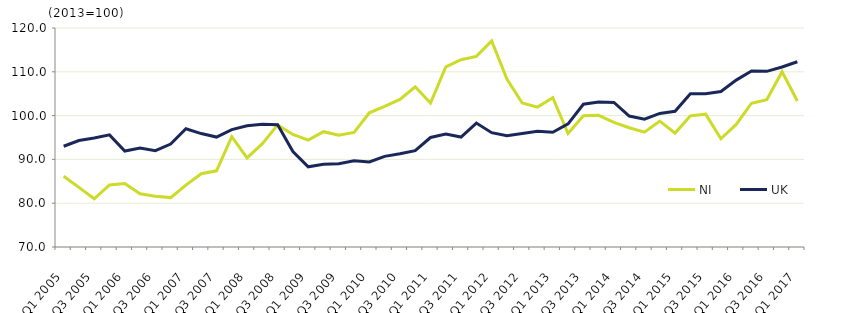
| Category | NI  | UK  |
|---|---|---|
| Q1 2005 | 86.144 | 93 |
| Q2 2005 | 83.615 | 94.3 |
| Q3 2005 | 81.009 | 94.9 |
| Q4 2005 | 84.174 | 95.6 |
| Q1 2006 | 84.515 | 91.9 |
| Q2 2006 | 82.167 | 92.6 |
| Q3 2006 | 81.605 | 92 |
| Q4 2006 | 81.277 | 93.5 |
| Q1 2007 | 84.128 | 97 |
| Q2 2007 | 86.719 | 95.9 |
| Q3 2007 | 87.388 | 95.1 |
| Q4 2007 | 95.18 | 96.8 |
| Q1 2008 | 90.342 | 97.7 |
| Q2 2008 | 93.585 | 98 |
| Q3 2008 | 97.884 | 97.9 |
| Q4 2008 | 95.686 | 91.8 |
| Q1 2009 | 94.416 | 88.3 |
| Q2 2009 | 96.327 | 88.9 |
| Q3 2009 | 95.526 | 89 |
| Q4 2009 | 96.163 | 89.7 |
| Q1 2010 | 100.64 | 89.4 |
| Q2 2010 | 102.09 | 90.7 |
| Q3 2010 | 103.69 | 91.3 |
| Q4 2010 | 106.565 | 92 |
| Q1 2011 | 102.843 | 95 |
| Q2 2011 | 111.119 | 95.8 |
| Q3 2011 | 112.753 | 95.1 |
| Q4 2011 | 113.523 | 98.3 |
| Q1 2012 | 117.056 | 96.1 |
| Q2 2012 | 108.362 | 95.4 |
| Q3 2012 | 102.89 | 95.9 |
| Q4 2012 | 101.947 | 96.4 |
| Q1 2013 | 104.068 | 96.2 |
| Q2 2013 | 95.908 | 98.1 |
| Q3 2013 | 99.964 | 102.6 |
| Q4 2013 | 100.06 | 103.1 |
| Q1 2014 | 98.437 | 103 |
| Q2 2014 | 97.239 | 99.9 |
| Q3 2014 | 96.231 | 99.2 |
| Q4 2014 | 98.737 | 100.5 |
| Q1 2015 | 96.005 | 101 |
| Q2 2015 | 99.943 | 105 |
| Q3 2015 | 100.323 | 105 |
| Q4 2015 | 94.72 | 105.5 |
| Q1 2016 | 97.977 | 108.1 |
| Q2 2016 | 102.823 | 110.2 |
| Q3 2016 | 103.631 | 110.1 |
| Q4 2016 | 110.024 | 111.1 |
| Q1 2017 | 103.336 | 112.3 |